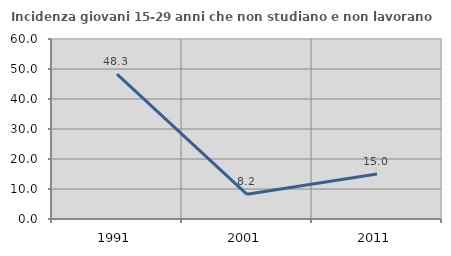
| Category | Incidenza giovani 15-29 anni che non studiano e non lavorano  |
|---|---|
| 1991.0 | 48.306 |
| 2001.0 | 8.227 |
| 2011.0 | 15.009 |